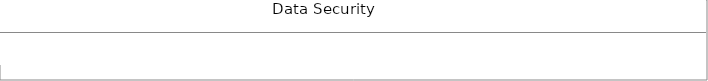
| Category | Series 0 | Series 1 |
|---|---|---|
| 0 | 0 | 0 |
| 1 | 0 | 0 |